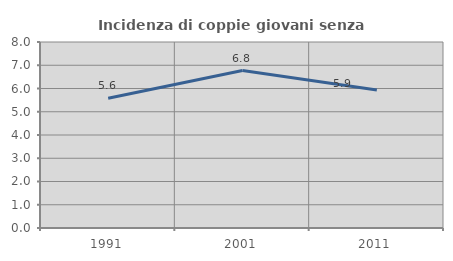
| Category | Incidenza di coppie giovani senza figli |
|---|---|
| 1991.0 | 5.577 |
| 2001.0 | 6.771 |
| 2011.0 | 5.933 |